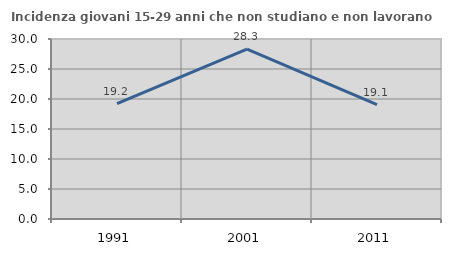
| Category | Incidenza giovani 15-29 anni che non studiano e non lavorano  |
|---|---|
| 1991.0 | 19.227 |
| 2001.0 | 28.323 |
| 2011.0 | 19.052 |